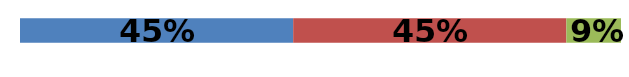
| Category | Series 0 | Series 1 | Series 2 |
|---|---|---|---|
| 0 | 0.455 | 0.455 | 0.091 |